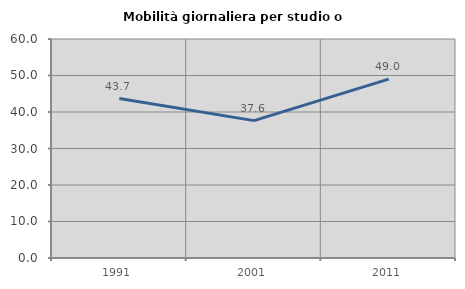
| Category | Mobilità giornaliera per studio o lavoro |
|---|---|
| 1991.0 | 43.676 |
| 2001.0 | 37.637 |
| 2011.0 | 49.002 |